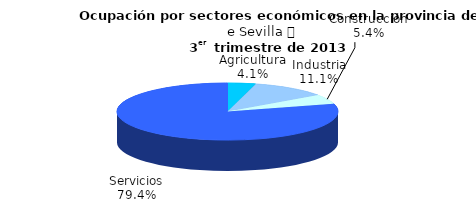
| Category | Series 0 |
|---|---|
| Agricultura | 24.8 |
| Industria | 67 |
| Construcción | 32.3 |
| Servicios | 478.6 |